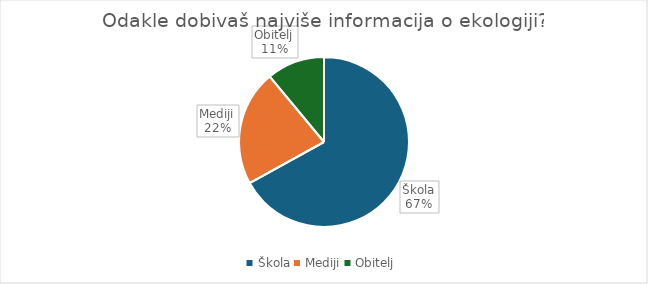
| Category | Series 0 |
|---|---|
| Škola | 73 |
| Mediji | 24 |
| Obitelj | 12 |